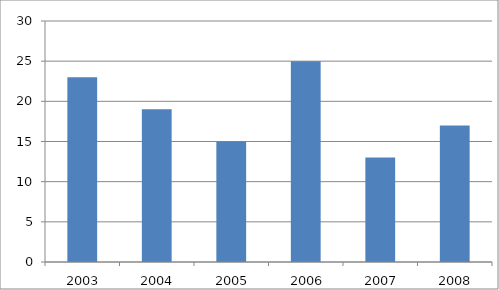
| Category | Series 0 |
|---|---|
| 2003 URTEA | 23 |
| 2004 URTEA | 19 |
| 2005 URTEA | 15 |
|  2006 URTEA | 25 |
| 2007 URTEA | 13 |
| 2008 URTEA | 17 |